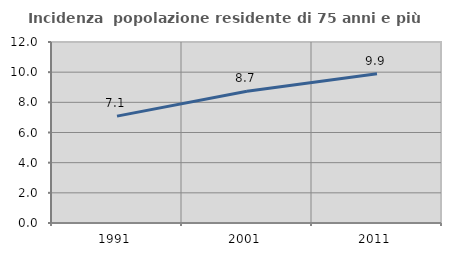
| Category | Incidenza  popolazione residente di 75 anni e più |
|---|---|
| 1991.0 | 7.086 |
| 2001.0 | 8.735 |
| 2011.0 | 9.893 |